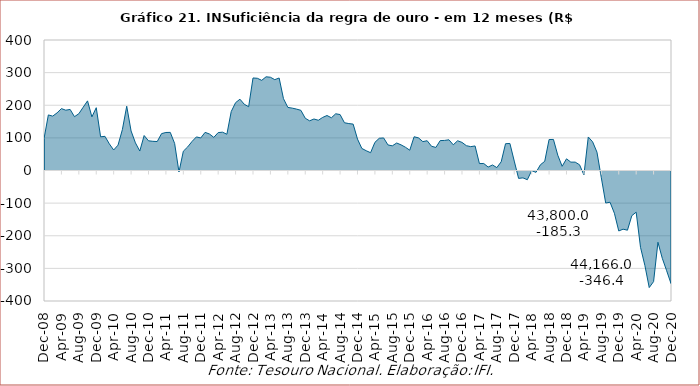
| Category | Insuficiência |
|---|---|
| 2008-12-01 | 97.108 |
| 2009-01-01 | 170.313 |
| 2009-02-01 | 166.636 |
| 2009-03-01 | 176.661 |
| 2009-04-01 | 189.671 |
| 2009-05-01 | 184.82 |
| 2009-06-01 | 187.203 |
| 2009-07-01 | 164.967 |
| 2009-08-01 | 174.008 |
| 2009-09-01 | 194.017 |
| 2009-10-01 | 213.434 |
| 2009-11-01 | 164.291 |
| 2009-12-01 | 192.497 |
| 2010-01-01 | 103.352 |
| 2010-02-01 | 104.706 |
| 2010-03-01 | 81.722 |
| 2010-04-01 | 62.865 |
| 2010-05-01 | 77.729 |
| 2010-06-01 | 125.406 |
| 2010-07-01 | 197.042 |
| 2010-08-01 | 121.132 |
| 2010-09-01 | 84.669 |
| 2010-10-01 | 59.643 |
| 2010-11-01 | 107.148 |
| 2010-12-01 | 91.044 |
| 2011-01-01 | 89.496 |
| 2011-02-01 | 88.754 |
| 2011-03-01 | 113.073 |
| 2011-04-01 | 116.533 |
| 2011-05-01 | 116.837 |
| 2011-06-01 | 82.826 |
| 2011-07-01 | -4.531 |
| 2011-08-01 | 59.184 |
| 2011-09-01 | 72.284 |
| 2011-10-01 | 88.998 |
| 2011-11-01 | 102.924 |
| 2011-12-01 | 99.795 |
| 2012-01-01 | 116.908 |
| 2012-02-01 | 111.848 |
| 2012-03-01 | 101.486 |
| 2012-04-01 | 116.228 |
| 2012-05-01 | 117.471 |
| 2012-06-01 | 111.087 |
| 2012-07-01 | 180.742 |
| 2012-08-01 | 207.941 |
| 2012-09-01 | 218.569 |
| 2012-10-01 | 202.978 |
| 2012-11-01 | 195.476 |
| 2012-12-01 | 283.62 |
| 2013-01-01 | 282.701 |
| 2013-02-01 | 276.302 |
| 2013-03-01 | 287.238 |
| 2013-04-01 | 285.863 |
| 2013-05-01 | 278.457 |
| 2013-06-01 | 283.539 |
| 2013-07-01 | 220.209 |
| 2013-08-01 | 193.428 |
| 2013-09-01 | 191.18 |
| 2013-10-01 | 188.215 |
| 2013-11-01 | 184.416 |
| 2013-12-01 | 160.178 |
| 2014-01-01 | 152.281 |
| 2014-02-01 | 157.884 |
| 2014-03-01 | 153.997 |
| 2014-04-01 | 162.735 |
| 2014-05-01 | 168.538 |
| 2014-06-01 | 161.601 |
| 2014-07-01 | 173.89 |
| 2014-08-01 | 171.487 |
| 2014-09-01 | 146.391 |
| 2014-10-01 | 143.832 |
| 2014-11-01 | 142.19 |
| 2014-12-01 | 96.22 |
| 2015-01-01 | 67.58 |
| 2015-02-01 | 60.608 |
| 2015-03-01 | 54.503 |
| 2015-04-01 | 86.27 |
| 2015-05-01 | 98.82 |
| 2015-06-01 | 99.84 |
| 2015-07-01 | 78.345 |
| 2015-08-01 | 75.61 |
| 2015-09-01 | 84.248 |
| 2015-10-01 | 78.622 |
| 2015-11-01 | 71.376 |
| 2015-12-01 | 62.154 |
| 2016-01-01 | 103.405 |
| 2016-02-01 | 100.037 |
| 2016-03-01 | 88.599 |
| 2016-04-01 | 91.252 |
| 2016-05-01 | 74.275 |
| 2016-06-01 | 70.705 |
| 2016-07-01 | 91.748 |
| 2016-08-01 | 92.146 |
| 2016-09-01 | 94.15 |
| 2016-10-01 | 78.765 |
| 2016-11-01 | 91.195 |
| 2016-12-01 | 86.156 |
| 2017-01-01 | 76.144 |
| 2017-02-01 | 73.108 |
| 2017-03-01 | 75.238 |
| 2017-04-01 | 21.279 |
| 2017-05-01 | 21.402 |
| 2017-06-01 | 10.566 |
| 2017-07-01 | 16.944 |
| 2017-08-01 | 8.899 |
| 2017-09-01 | 26.735 |
| 2017-10-01 | 82.122 |
| 2017-11-01 | 82.893 |
| 2017-12-01 | 28.8 |
| 2018-01-01 | -24.196 |
| 2018-02-01 | -22.586 |
| 2018-03-01 | -28.269 |
| 2018-04-01 | -0.539 |
| 2018-05-01 | -5.672 |
| 2018-06-01 | 17.455 |
| 2018-07-01 | 28.191 |
| 2018-08-01 | 94.975 |
| 2018-09-01 | 95.209 |
| 2018-10-01 | 46.867 |
| 2018-11-01 | 12.857 |
| 2018-12-01 | 35.801 |
| 2019-01-01 | 25.646 |
| 2019-02-01 | 25.63 |
| 2019-03-01 | 17.527 |
| 2019-04-01 | -13.725 |
| 2019-05-01 | 102.735 |
| 2019-06-01 | 87.866 |
| 2019-07-01 | 56.109 |
| 2019-08-01 | -22.486 |
| 2019-09-01 | -99.685 |
| 2019-10-01 | -97.318 |
| 2019-11-01 | -131.036 |
| 2019-12-01 | -185.304 |
| 2020-01-01 | -179.853 |
| 2020-02-01 | -182.953 |
| 2020-03-01 | -138.534 |
| 2020-04-01 | -127.722 |
| 2020-05-01 | -235.488 |
| 2020-06-01 | -291.115 |
| 2020-07-01 | -358.858 |
| 2020-08-01 | -340.512 |
| 2020-09-01 | -219.981 |
| 2020-10-01 | -269.131 |
| 2020-11-01 | -307.186 |
| 2020-12-01 | -346.432 |